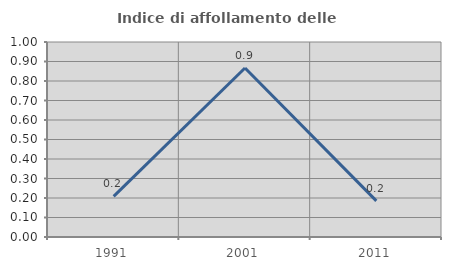
| Category | Indice di affollamento delle abitazioni  |
|---|---|
| 1991.0 | 0.208 |
| 2001.0 | 0.867 |
| 2011.0 | 0.185 |